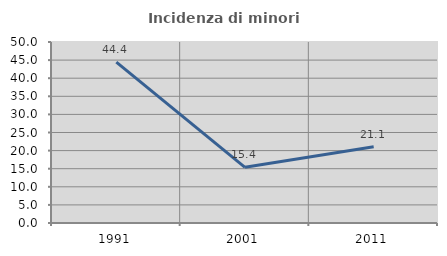
| Category | Incidenza di minori stranieri |
|---|---|
| 1991.0 | 44.444 |
| 2001.0 | 15.385 |
| 2011.0 | 21.053 |